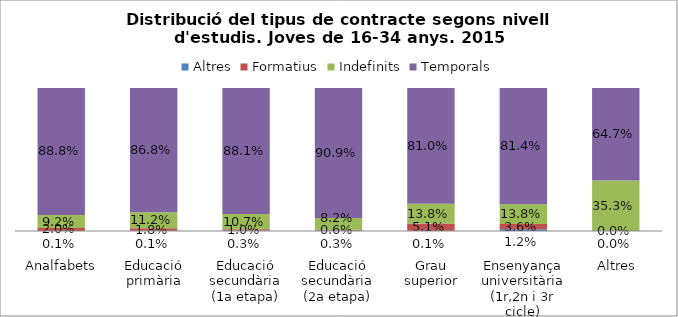
| Category | Altres | Formatius | Indefinits | Temporals |
|---|---|---|---|---|
|  
Analfabets | 0.001 | 0.02 | 0.092 | 0.888 |
| 
Educació primària | 0.001 | 0.018 | 0.112 | 0.868 |
| 
Educació secundària (1a etapa) | 0.003 | 0.01 | 0.107 | 0.881 |
| 
Educació secundària (2a etapa) | 0.003 | 0.006 | 0.082 | 0.909 |
| 
Grau superior | 0.001 | 0.051 | 0.138 | 0.81 |
| 
Ensenyança universitària (1r,2n i 3r cicle) | 0.012 | 0.036 | 0.138 | 0.814 |
| 
Altres | 0 | 0 | 0.353 | 0.647 |